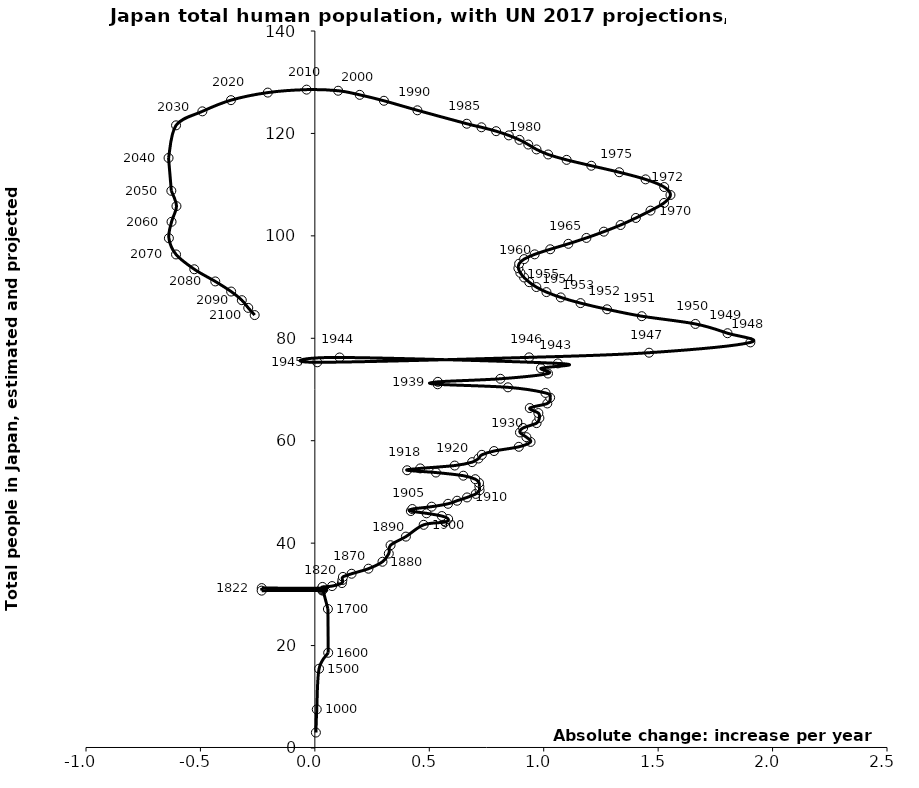
| Category | Series 0 |
|---|---|
| 0.004522913264062901 | 3.015 |
| 0.008314302049422573 | 7.538 |
| 0.018426683668404407 | 15.478 |
| 0.058295326514588484 | 18.594 |
| 0.057107490707864916 | 27.137 |
| 0.03349883335630621 | 31.158 |
| 0.033008956801246825 | 31.191 |
| -0.23222845102562495 | 31.224 |
| -0.23247434615123197 | 30.726 |
| 0.03255185772215263 | 30.759 |
| 0.0326554186294293 | 30.791 |
| 0.032759357926256526 | 30.955 |
| 0.03293316185338959 | 31.119 |
| 0.03310788789276735 | 31.284 |
| 0.03328354093662824 | 31.45 |
| 0.07523511268784588 | 31.617 |
| 0.1181828588214561 | 32.203 |
| 0.12037140350686784 | 32.799 |
| 0.12260047630174639 | 33.406 |
| 0.16056698970082978 | 34.025 |
| 0.23416352246286037 | 35.012 |
| 0.29552029353857134 | 36.366 |
| 0.323086379094326 | 37.967 |
| 0.33079302666905336 | 39.597 |
| 0.3977815786647575 | 41.275 |
| 0.4754079390648928 | 43.575 |
| 0.569106282441382 | 44.127 |
| 0.5824447109360982 | 44.713 |
| 0.5547798222063136 | 45.292 |
| 0.4880876797327147 | 45.823 |
| 0.41941947377841515 | 46.269 |
| 0.4258416800906879 | 46.662 |
| 0.5103183938905786 | 47.12 |
| 0.5819506950659274 | 47.682 |
| 0.621471964679909 | 48.284 |
| 0.6649453612552918 | 48.925 |
| 0.7029845832587576 | 49.614 |
| 0.7197811228447009 | 50.331 |
| 0.7187930911043452 | 51.054 |
| 0.7173110434938259 | 51.769 |
| 0.7010085197780604 | 52.488 |
| 0.6486428375395263 | 53.171 |
| 0.5290909969572191 | 53.785 |
| 0.4031169500626426 | 54.229 |
| 0.4604227910029266 | 54.592 |
| 0.611097631406242 | 55.15 |
| 0.6871760754131593 | 55.814 |
| 0.714840964142951 | 56.524 |
| 0.7296614402481936 | 57.244 |
| 0.7830151542270762 | 57.984 |
| 0.8912046297953644 | 58.81 |
| 0.9425822802935357 | 59.766 |
| 0.9243036930970696 | 60.695 |
| 0.8961447884971072 | 61.615 |
| 0.9099772328619977 | 62.487 |
| 0.9687651214128081 | 63.435 |
| 0.9811155181671758 | 64.425 |
| 0.9766693753355966 | 65.397 |
| 0.9391241692023158 | 66.378 |
| 1.0156966290794145 | 67.275 |
| 1.0280470258337857 | 68.409 |
| 1.0077923751566118 | 69.331 |
| 0.843779106258566 | 70.425 |
| 0.5365012350098439 | 71.019 |
| 0.5374892667501925 | 71.498 |
| 0.8106800429568608 | 72.094 |
| 1.0186607243004602 | 73.119 |
| 0.9880317403496193 | 74.131 |
| 1.0616401050056723 | 75.095 |
| 0.10818947556828107 | 76.254 |
| 0.010374333273666991 | 75.312 |
| 0.9361600739812701 | 76.275 |
| 1.4603109122367428 | 77.184 |
| 1.902949131913374 | 79.196 |
| 1.8031999261380562 | 80.99 |
| 1.6628256059006006 | 82.802 |
| 1.4282995000000014 | 84.316 |
| 1.276912000000003 | 85.659 |
| 1.1608175000000003 | 86.869 |
| 1.0744159999999994 | 87.98 |
| 1.0119974999999997 | 89.018 |
| 0.9678484999999952 | 90.004 |
| 0.936695499999999 | 90.954 |
| 0.9141350000000017 | 91.878 |
| 0.8979555000000019 | 92.782 |
| 0.8893105000000006 | 93.674 |
| 0.8926330000000036 | 94.561 |
| 0.9145540000000025 | 95.459 |
| 0.9604834999999952 | 96.39 |
| 1.028524499999996 | 97.38 |
| 1.1076400000000035 | 98.447 |
| 1.1865094999999997 | 99.595 |
| 1.2626769999999965 | 100.82 |
| 1.3359544999999997 | 102.12 |
| 1.4025815000000037 | 103.492 |
| 1.4666695000000018 | 104.926 |
| 1.525697000000001 | 106.425 |
| 1.5538044999999983 | 107.977 |
| 1.5265509999999978 | 109.533 |
| 1.4450885000000042 | 111.03 |
| 1.3299834999999973 | 112.423 |
| 1.2080324999999945 | 113.69 |
| 1.1000879999999995 | 114.839 |
| 1.0194530000000057 | 115.89 |
| 0.9685355000000015 | 116.878 |
| 0.9325769999999949 | 117.827 |
| 0.8941344999999998 | 118.743 |
| 0.8474535000000003 | 119.616 |
| 0.7920875000000009 | 120.438 |
| 0.7279754999999994 | 121.2 |
| 0.6638634999999979 | 121.894 |
| 0.44814280000000084 | 124.516 |
| 0.3018372999999997 | 126.375 |
| 0.19603010000000012 | 127.534 |
| 0.10179389999999984 | 128.336 |
| -0.036080900000000325 | 128.552 |
| -0.20562259999999952 | 127.975 |
| -0.3665149999999997 | 126.496 |
| -0.4915142000000003 | 124.31 |
| -0.6065160666666666 | 121.581 |
| -0.6393029500000005 | 115.212 |
| -0.6271047333333333 | 108.794 |
| -0.6047269 | 105.805 |
| -0.6262016000000002 | 102.747 |
| -0.6377934999999993 | 99.543 |
| -0.6065877999999998 | 96.369 |
| -0.5268598999999995 | 93.478 |
| -0.43516840000000057 | 91.101 |
| -0.3657666000000006 | 89.126 |
| -0.31916259999999996 | 87.443 |
| -0.2910589000000002 | 85.934 |
| -0.2629552000000004 | 84.532 |